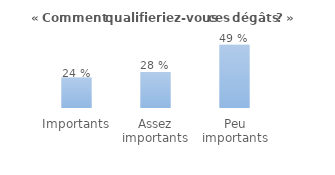
| Category | Series 0 |
|---|---|
| Importants | 0.236 |
| Assez importants | 0.277 |
| Peu importants | 0.486 |